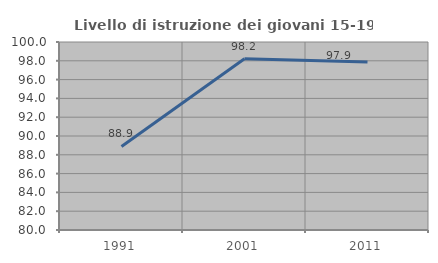
| Category | Livello di istruzione dei giovani 15-19 anni |
|---|---|
| 1991.0 | 88.889 |
| 2001.0 | 98.214 |
| 2011.0 | 97.872 |